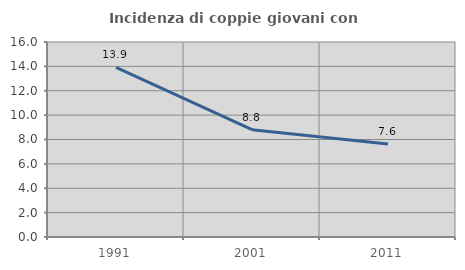
| Category | Incidenza di coppie giovani con figli |
|---|---|
| 1991.0 | 13.915 |
| 2001.0 | 8.801 |
| 2011.0 | 7.632 |